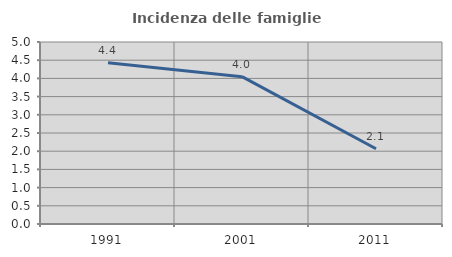
| Category | Incidenza delle famiglie numerose |
|---|---|
| 1991.0 | 4.431 |
| 2001.0 | 4.048 |
| 2011.0 | 2.068 |